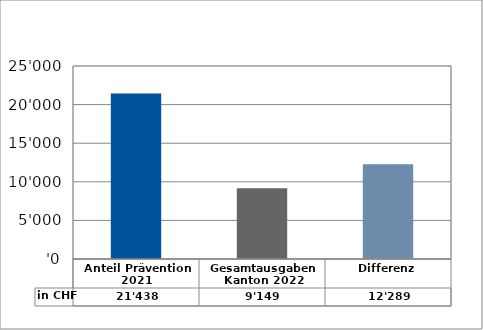
| Category | in CHF |
|---|---|
| Anteil Prävention 2021

 | 21437.9 |
| Gesamtausgaben Kanton 2022
 | 9149 |
| Differenz | 12288.9 |